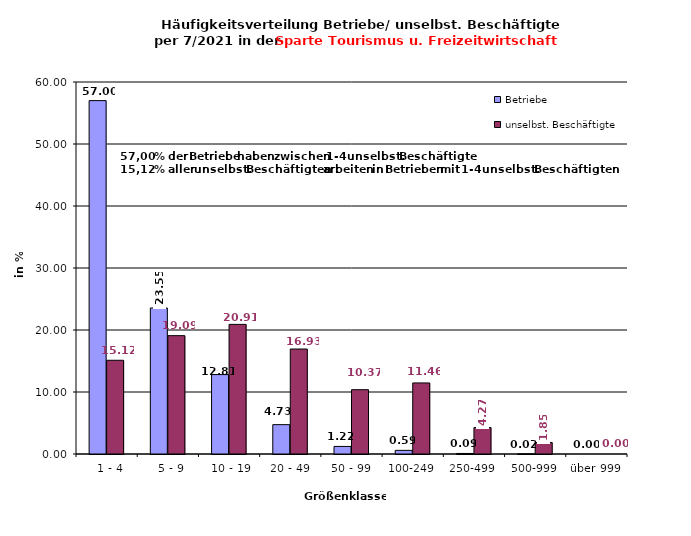
| Category | Betriebe | unselbst. Beschäftigte |
|---|---|---|
|   1 - 4 | 56.998 | 15.118 |
|   5 - 9 | 23.55 | 19.089 |
|  10 - 19 | 12.808 | 20.906 |
| 20 - 49 | 4.734 | 16.933 |
| 50 - 99 | 1.222 | 10.373 |
| 100-249 | 0.585 | 11.464 |
| 250-499 | 0.086 | 4.265 |
| 500-999 | 0.017 | 1.853 |
| über 999 | 0 | 0 |